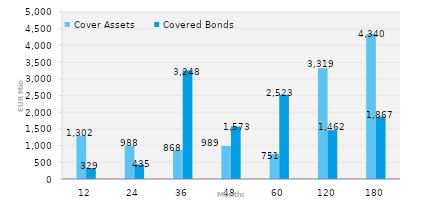
| Category | Cover Assets | Covered Bonds |
|---|---|---|
| 12.0 | 1301.86 | 328.874 |
| 24.0 | 987.831 | 434.948 |
| 36.0 | 868.062 | 3247.71 |
| 48.0 | 988.871 | 1572.8 |
| 60.0 | 751.295 | 2522.726 |
| 120.0 | 3318.77 | 1462.275 |
| 180.0 | 4340.042 | 1867.019 |